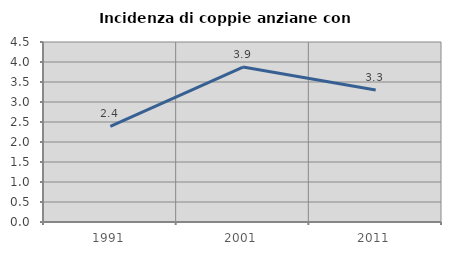
| Category | Incidenza di coppie anziane con figli |
|---|---|
| 1991.0 | 2.389 |
| 2001.0 | 3.874 |
| 2011.0 | 3.299 |